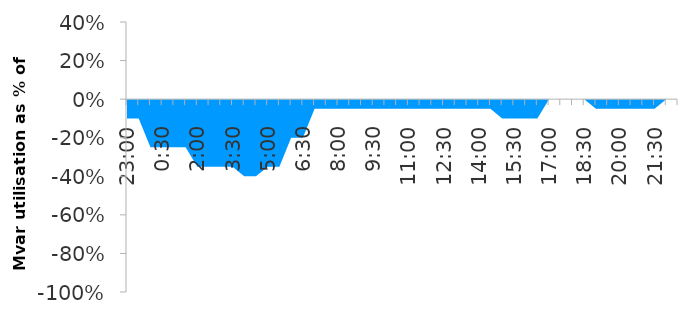
| Category | Series 0 |
|---|---|
| 0.9583333333333334 | -0.1 |
| 0.9791666666666666 | -0.1 |
| 0.0 | -0.25 |
| 0.020833333333333332 | -0.25 |
| 0.041666666666666664 | -0.25 |
| 0.0625 | -0.25 |
| 0.08333333333333333 | -0.35 |
| 0.10416666666666667 | -0.35 |
| 0.125 | -0.35 |
| 0.14583333333333334 | -0.35 |
| 0.16666666666666666 | -0.4 |
| 0.1875 | -0.4 |
| 0.20833333333333334 | -0.35 |
| 0.22916666666666666 | -0.35 |
| 0.25 | -0.2 |
| 0.2708333333333333 | -0.2 |
| 0.2916666666666667 | -0.05 |
| 0.3125 | -0.05 |
| 0.3333333333333333 | -0.05 |
| 0.3541666666666667 | -0.05 |
| 0.375 | -0.05 |
| 0.3958333333333333 | -0.05 |
| 0.4166666666666667 | -0.05 |
| 0.4375 | -0.05 |
| 0.4583333333333333 | -0.05 |
| 0.4791666666666667 | -0.05 |
| 0.5 | -0.05 |
| 0.5208333333333334 | -0.05 |
| 0.5416666666666666 | -0.05 |
| 0.5625 | -0.05 |
| 0.5833333333333334 | -0.05 |
| 0.6041666666666666 | -0.05 |
| 0.625 | -0.1 |
| 0.6458333333333334 | -0.1 |
| 0.6666666666666666 | -0.1 |
| 0.6875 | -0.1 |
| 0.7083333333333334 | 0 |
| 0.7291666666666666 | 0 |
| 0.75 | 0 |
| 0.7708333333333334 | 0 |
| 0.7916666666666666 | -0.05 |
| 0.8125 | -0.05 |
| 0.8333333333333334 | -0.05 |
| 0.8541666666666666 | -0.05 |
| 0.875 | -0.05 |
| 0.8958333333333334 | -0.05 |
| 0.9166666666666666 | 0 |
| 0.9375 | 0 |